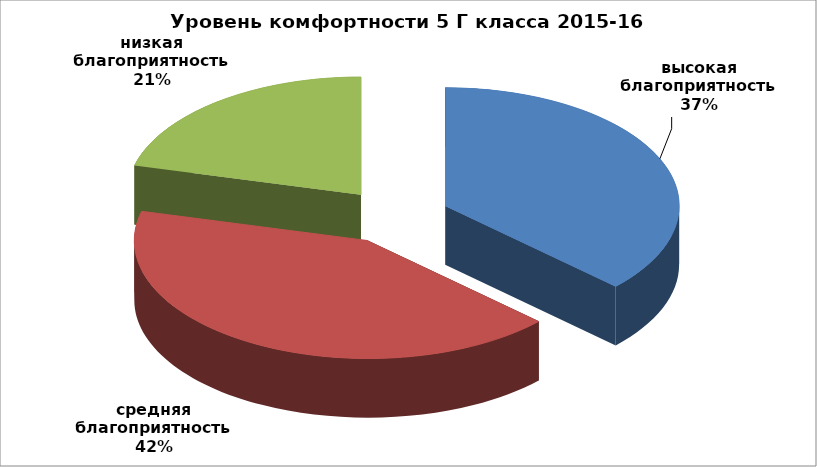
| Category | Series 0 |
|---|---|
| высокая благоприятность | 0.37 |
| средняя благоприятность | 0.42 |
| низкая благоприятность | 0.21 |